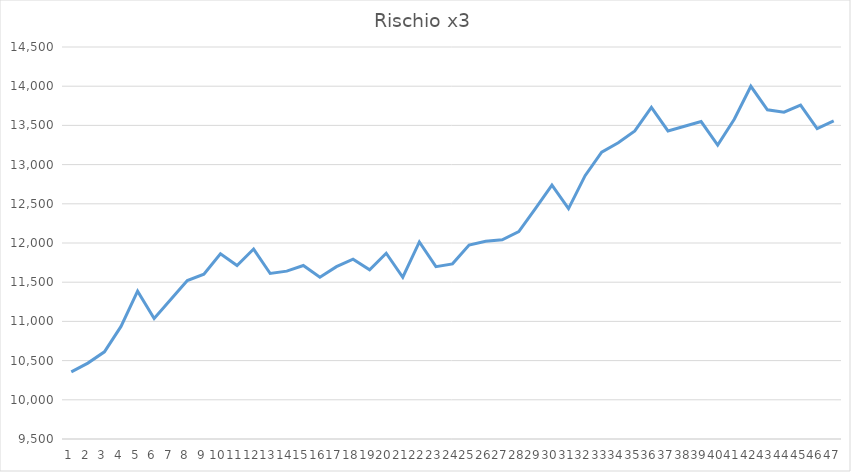
| Category | Series 0 |
|---|---|
| 0 | 10357 |
| 1 | 10468 |
| 2 | 10612 |
| 3 | 10936 |
| 4 | 11386 |
| 5 | 11038 |
| 6 | 11278 |
| 7 | 11521 |
| 8 | 11602 |
| 9 | 11863 |
| 10 | 11713 |
| 11 | 11923 |
| 12 | 11611 |
| 13 | 11641 |
| 14 | 11713 |
| 15 | 11563 |
| 16 | 11698 |
| 17 | 11794 |
| 18 | 11659 |
| 19 | 11869 |
| 20 | 11563 |
| 21 | 12013 |
| 22 | 11698 |
| 23 | 11734 |
| 24 | 11974 |
| 25 | 12022 |
| 26 | 12040 |
| 27 | 12145 |
| 28 | 12439 |
| 29 | 12739 |
| 30 | 12439 |
| 31 | 12859 |
| 32 | 13159 |
| 33 | 13279 |
| 34 | 13429 |
| 35 | 13729 |
| 36 | 13429 |
| 37 | 13489 |
| 38 | 13549 |
| 39 | 13249 |
| 40 | 13579 |
| 41 | 13999 |
| 42 | 13699 |
| 43 | 13669 |
| 44 | 13759 |
| 45 | 13459 |
| 46 | 13558 |